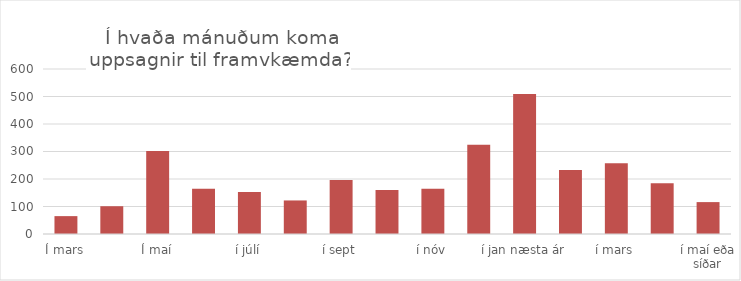
| Category | Series 0 |
|---|---|
| Í mars | 65 |
| Í apríl | 101 |
| Í maí | 302 |
| í júní | 165 |
| í júlí | 153 |
| í ágúst | 122 |
| í sept | 196 |
| í okt | 160 |
| í nóv | 165 |
| í des | 325 |
| í jan næsta ár | 509 |
| í feb | 233 |
| í mars | 257 |
| í apríl | 185 |
| í maí eða síðar | 116 |